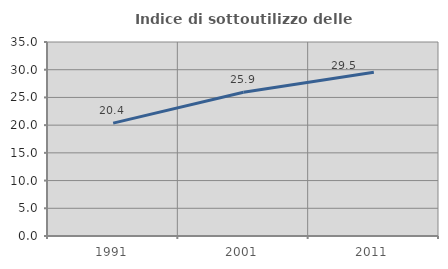
| Category | Indice di sottoutilizzo delle abitazioni  |
|---|---|
| 1991.0 | 20.366 |
| 2001.0 | 25.926 |
| 2011.0 | 29.527 |